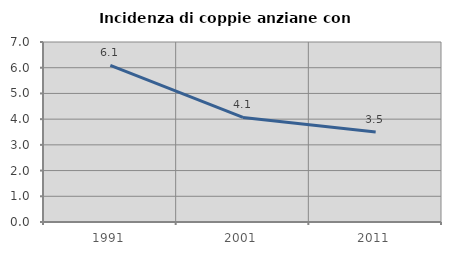
| Category | Incidenza di coppie anziane con figli |
|---|---|
| 1991.0 | 6.087 |
| 2001.0 | 4.065 |
| 2011.0 | 3.497 |